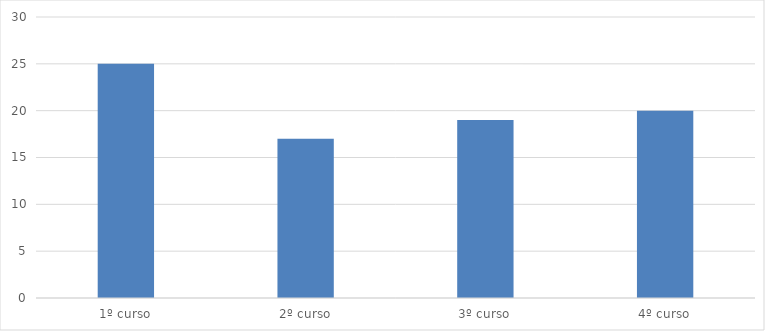
| Category | Series 0 |
|---|---|
| 1º curso | 25 |
| 2º curso | 17 |
| 3º curso | 19 |
| 4º curso | 20 |